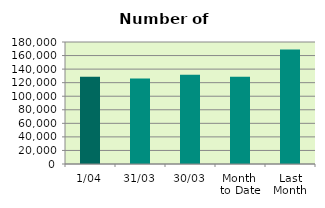
| Category | Series 0 |
|---|---|
| 1/04 | 128692 |
| 31/03 | 126020 |
| 30/03 | 131836 |
| Month 
to Date | 128692 |
| Last
Month | 168827.304 |